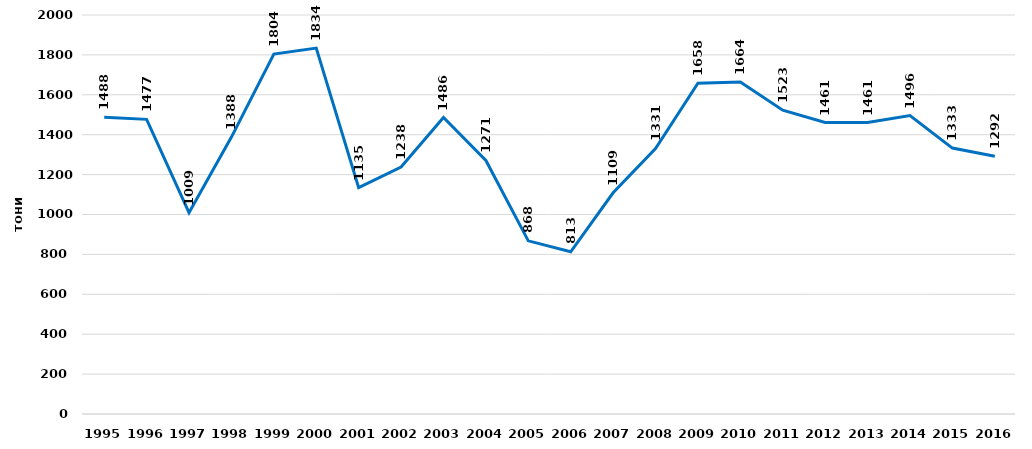
| Category | Вкупен улов на риба |
|---|---|
| 1995.0 | 1488 |
| 1996.0 | 1477 |
| 1997.0 | 1009 |
| 1998.0 | 1388 |
| 1999.0 | 1804 |
| 2000.0 | 1834 |
| 2001.0 | 1135 |
| 2002.0 | 1238 |
| 2003.0 | 1486 |
| 2004.0 | 1271 |
| 2005.0 | 868 |
| 2006.0 | 813 |
| 2007.0 | 1109 |
| 2008.0 | 1331 |
| 2009.0 | 1658 |
| 2010.0 | 1664 |
| 2011.0 | 1523 |
| 2012.0 | 1461 |
| 2013.0 | 1461 |
| 2014.0 | 1496 |
| 2015.0 | 1333 |
| 2016.0 | 1292 |